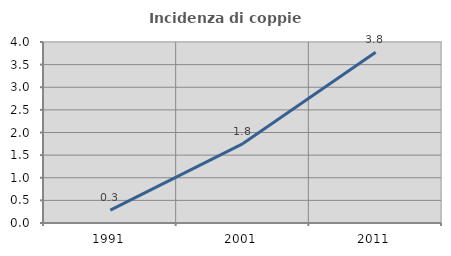
| Category | Incidenza di coppie miste |
|---|---|
| 1991.0 | 0.283 |
| 2001.0 | 1.756 |
| 2011.0 | 3.775 |